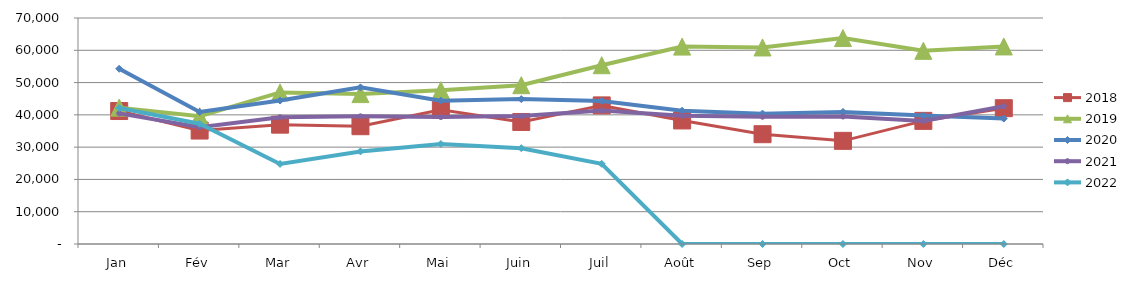
| Category | 2018 | 2019 | 2020 | 2021 | 2022 |
|---|---|---|---|---|---|
| Jan | 41189.736 | 42238.432 | 54273.068 | 40458.51 | 42125.233 |
| Fév | 35137.047 | 39568.195 | 40883.319 | 36200.926 | 37242.7 |
| Mar | 36966.816 | 46942.202 | 44426.392 | 39262.158 | 24799.582 |
| Avr | 36485.223 | 46427.766 | 48509.843 | 39555.16 | 28678.513 |
| Mai | 41558.724 | 47634.031 | 44407.424 | 39315.181 | 30966.293 |
| Juin | 37797.134 | 49186.221 | 44874.513 | 39615.13 | 29680.3 |
| Juil | 42927.847 | 55367.883 | 44316.236 | 41338.163 | 24823.846 |
| Août | 38263.165 | 61146.365 | 41285.559 | 39690.432 | 0 |
| Sep | 34011.672 | 60874.85 | 40379.909 | 39412.556 | 0 |
| Oct | 31946.792 | 63789.634 | 40903.528 | 39474.624 | 0 |
| Nov | 38139.513 | 59829.208 | 39772.437 | 38089.775 | 0 |
| Déc | 42064.579 | 61190.831 | 38851.183 | 42639.837 | 0 |